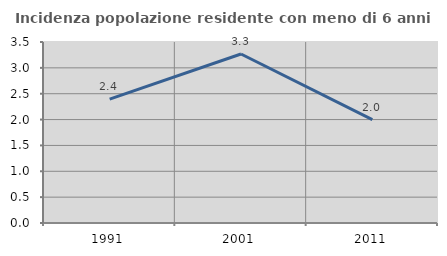
| Category | Incidenza popolazione residente con meno di 6 anni |
|---|---|
| 1991.0 | 2.395 |
| 2001.0 | 3.268 |
| 2011.0 | 2 |